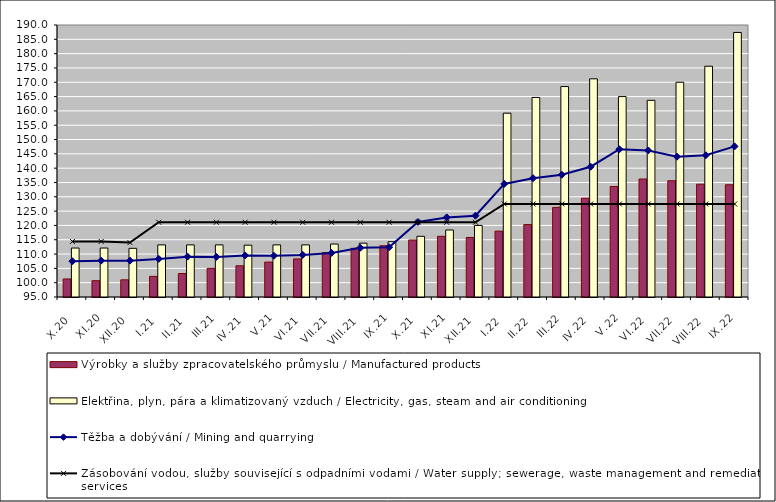
| Category | Výrobky a služby zpracovatelského průmyslu / Manufactured products | Elektřina, plyn, pára a klimatizovaný vzduch / Electricity, gas, steam and air conditioning |
|---|---|---|
| X.20 | 101.3 | 112.1 |
| XI.20 | 100.7 | 112.1 |
| XII.20 | 101 | 112 |
| I.21 | 102.2 | 113.2 |
| II.21 | 103.2 | 113.2 |
| III.21 | 105 | 113.2 |
| IV.21 | 105.9 | 113.1 |
| V.21 | 107.2 | 113.2 |
| VI.21 | 108.3 | 113.2 |
| VII.21 | 110.5 | 113.5 |
| VIII.21 | 112 | 113.8 |
| IX.21 | 112.9 | 114.3 |
| X.21 | 114.9 | 116.2 |
| XI.21 | 116.2 | 118.4 |
| XII.21 | 115.8 | 120 |
| I.22 | 118 | 159.2 |
| II.22 | 120.3 | 164.7 |
| III.22 | 126.3 | 168.5 |
| IV.22 | 129.5 | 171.2 |
| V.22 | 133.6 | 165 |
| VI.22 | 136.2 | 163.7 |
| VII.22 | 135.6 | 170 |
| VIII.22 | 134.4 | 175.6 |
| IX.22 | 134.2 | 187.4 |